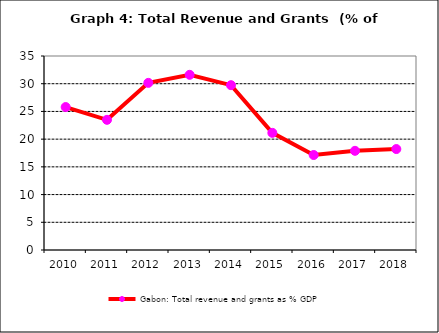
| Category | Gabon: Total revenue and grants as % GDP |
|---|---|
| 2010.0 | 25.789 |
| 2011.0 | 23.483 |
| 2012.0 | 30.154 |
| 2013.0 | 31.605 |
| 2014.0 | 29.735 |
| 2015.0 | 21.136 |
| 2016.0 | 17.138 |
| 2017.0 | 17.894 |
| 2018.0 | 18.213 |